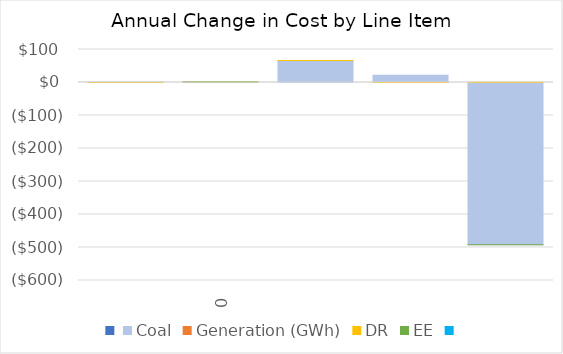
| Category | Series 0 | Coal | Generation (GWh) | DR | EE | Series 6 |
|---|---|---|---|---|---|---|
| nan |  | 1.517 |  | 0 | 0 |  |
| 0.0 |  | 2.488 |  | 0.043 | 0 |  |
| nan |  | 66.309 |  | 0.001 | 0 |  |
| nan |  | 22.272 |  | -0.008 | 0 |  |
| nan |  | -491.534 |  | 0.697 | 0 |  |